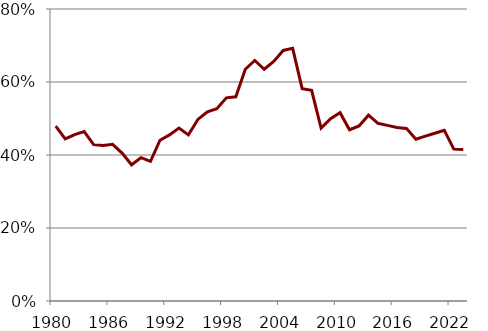
| Category | Series 0 |
|---|---|
| 1980.0 | 0.479 |
| 1981.0 | 0.444 |
| 1982.0 | 0.456 |
| 1983.0 | 0.464 |
| 1984.0 | 0.428 |
| 1985.0 | 0.426 |
| 1986.0 | 0.429 |
| 1987.0 | 0.405 |
| 1988.0 | 0.373 |
| 1989.0 | 0.393 |
| 1990.0 | 0.383 |
| 1991.0 | 0.44 |
| 1992.0 | 0.455 |
| 1993.0 | 0.474 |
| 1994.0 | 0.455 |
| 1995.0 | 0.497 |
| 1996.0 | 0.518 |
| 1997.0 | 0.527 |
| 1998.0 | 0.557 |
| 1999.0 | 0.559 |
| 2000.0 | 0.635 |
| 2001.0 | 0.659 |
| 2002.0 | 0.635 |
| 2003.0 | 0.656 |
| 2004.0 | 0.686 |
| 2005.0 | 0.692 |
| 2006.0 | 0.582 |
| 2007.0 | 0.577 |
| 2008.0 | 0.474 |
| 2009.0 | 0.5 |
| 2010.0 | 0.516 |
| 2011.0 | 0.469 |
| 2012.0 | 0.479 |
| 2013.0 | 0.509 |
| 2014.0 | 0.487 |
| 2015.0 | 0.481 |
| 2016.0 | 0.476 |
| 2017.0 | 0.473 |
| 2018.0 | 0.443 |
| 2019.0 | 0.452 |
| 2020.0 | 0.46 |
| 2021.0 | 0.468 |
| 2022.0 | 0.416 |
| 2023.0 | 0.415 |